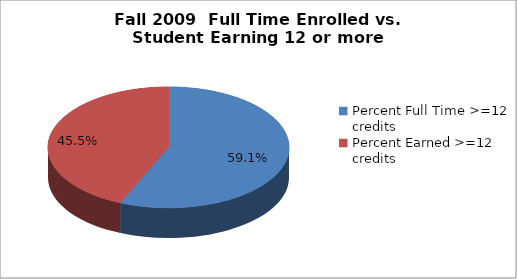
| Category | Series 0 |
|---|---|
| Percent Full Time >=12 credits | 0.591 |
| Percent Earned >=12 credits | 0.455 |